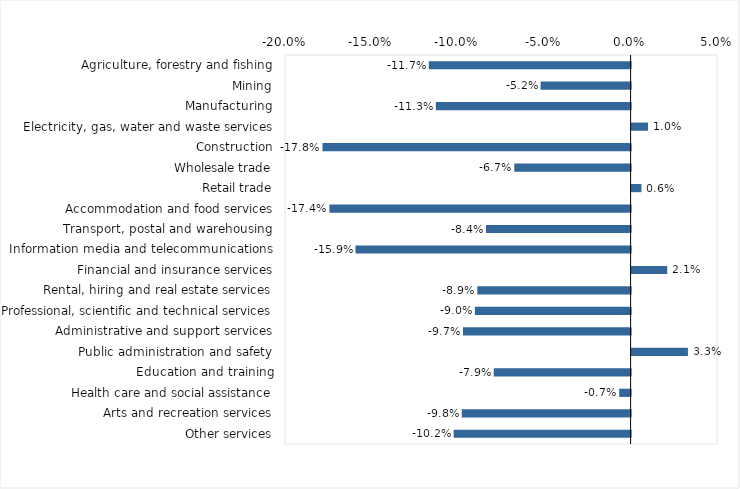
| Category | This week |
|---|---|
| Agriculture, forestry and fishing | -0.117 |
| Mining | -0.052 |
| Manufacturing | -0.113 |
| Electricity, gas, water and waste services | 0.01 |
| Construction | -0.178 |
| Wholesale trade | -0.067 |
| Retail trade | 0.006 |
| Accommodation and food services | -0.174 |
| Transport, postal and warehousing | -0.084 |
| Information media and telecommunications | -0.159 |
| Financial and insurance services | 0.021 |
| Rental, hiring and real estate services | -0.089 |
| Professional, scientific and technical services | -0.09 |
| Administrative and support services | -0.097 |
| Public administration and safety | 0.033 |
| Education and training | -0.079 |
| Health care and social assistance | -0.007 |
| Arts and recreation services | -0.098 |
| Other services | -0.102 |